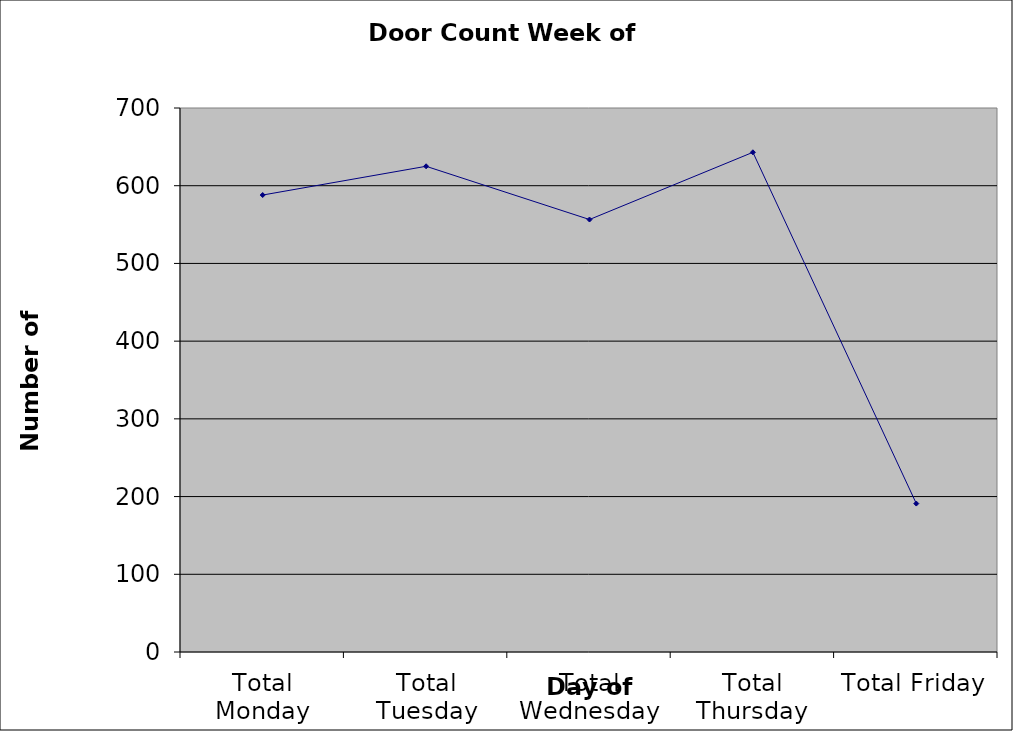
| Category | Series 0 |
|---|---|
| Total Monday | 588 |
| Total Tuesday | 625 |
| Total Wednesday | 556.5 |
| Total Thursday | 643 |
| Total Friday | 191 |